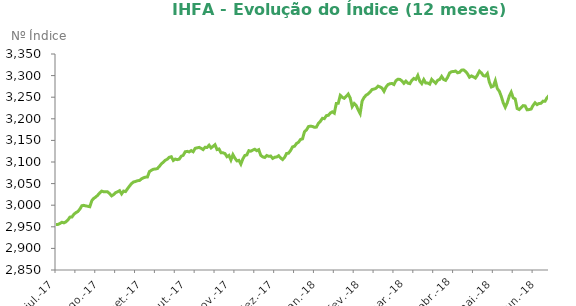
| Category | Series 0 |
|---|---|
| 2017-07-03 | 2955.6 |
| 2017-07-04 | 2955.56 |
| 2017-07-05 | 2957.73 |
| 2017-07-06 | 2960.53 |
| 2017-07-07 | 2959.17 |
| 2017-07-10 | 2961.57 |
| 2017-07-11 | 2965.8 |
| 2017-07-12 | 2972.4 |
| 2017-07-13 | 2972.53 |
| 2017-07-14 | 2979.01 |
| 2017-07-17 | 2982.73 |
| 2017-07-18 | 2985.4 |
| 2017-07-19 | 2990.95 |
| 2017-07-20 | 2998.74 |
| 2017-07-21 | 2999.62 |
| 2017-07-24 | 2998.28 |
| 2017-07-25 | 2997.56 |
| 2017-07-26 | 2996.42 |
| 2017-07-27 | 3010.5 |
| 2017-07-28 | 3015.89 |
| 2017-07-31 | 3018.91 |
| 2017-08-01 | 3023.15 |
| 2017-08-02 | 3028.5 |
| 2017-08-03 | 3032.62 |
| 2017-08-04 | 3031.1 |
| 2017-08-07 | 3030.9 |
| 2017-08-08 | 3030.85 |
| 2017-08-09 | 3026.58 |
| 2017-08-10 | 3021.59 |
| 2017-08-11 | 3024.69 |
| 2017-08-14 | 3029.04 |
| 2017-08-15 | 3031.14 |
| 2017-08-16 | 3033.62 |
| 2017-08-17 | 3026.19 |
| 2017-08-18 | 3032.71 |
| 2017-08-21 | 3031.49 |
| 2017-08-22 | 3038.28 |
| 2017-08-23 | 3044.37 |
| 2017-08-24 | 3050.08 |
| 2017-08-25 | 3053.71 |
| 2017-08-28 | 3054.88 |
| 2017-08-29 | 3056.68 |
| 2017-08-30 | 3057.22 |
| 2017-08-31 | 3060.96 |
| 2017-09-01 | 3063.36 |
| 2017-09-04 | 3064.89 |
| 2017-09-05 | 3065.3 |
| 2017-09-06 | 3077.87 |
| 2017-09-08 | 3080.91 |
| 2017-09-11 | 3083.37 |
| 2017-09-12 | 3083.7 |
| 2017-09-13 | 3084.82 |
| 2017-09-14 | 3089.87 |
| 2017-09-15 | 3095.68 |
| 2017-09-18 | 3099.68 |
| 2017-09-19 | 3104.11 |
| 2017-09-20 | 3106.43 |
| 2017-09-21 | 3110.87 |
| 2017-09-22 | 3112.23 |
| 2017-09-25 | 3103.56 |
| 2017-09-26 | 3106.82 |
| 2017-09-27 | 3105.4 |
| 2017-09-28 | 3106.68 |
| 2017-09-29 | 3113.35 |
| 2017-10-02 | 3115.51 |
| 2017-10-03 | 3123.73 |
| 2017-10-04 | 3124.65 |
| 2017-10-05 | 3123.31 |
| 2017-10-06 | 3126.44 |
| 2017-10-09 | 3123.64 |
| 2017-10-10 | 3131.59 |
| 2017-10-11 | 3132.76 |
| 2017-10-13 | 3133.85 |
| 2017-10-16 | 3131.7 |
| 2017-10-17 | 3128.73 |
| 2017-10-18 | 3134.21 |
| 2017-10-19 | 3133.57 |
| 2017-10-20 | 3138.87 |
| 2017-10-23 | 3132.56 |
| 2017-10-24 | 3136.24 |
| 2017-10-25 | 3140.07 |
| 2017-10-26 | 3128.75 |
| 2017-10-27 | 3130.14 |
| 2017-10-30 | 3121.42 |
| 2017-10-31 | 3121.27 |
| 2017-11-01 | 3119.52 |
| 2017-11-03 | 3112.33 |
| 2017-11-06 | 3115.26 |
| 2017-11-07 | 3104.62 |
| 2017-11-08 | 3116.99 |
| 2017-11-09 | 3108.9 |
| 2017-11-10 | 3102.58 |
| 2017-11-13 | 3103.84 |
| 2017-11-14 | 3095.13 |
| 2017-11-16 | 3107.22 |
| 2017-11-17 | 3115.17 |
| 2017-11-20 | 3116.49 |
| 2017-11-21 | 3126.26 |
| 2017-11-22 | 3124.96 |
| 2017-11-23 | 3127.6 |
| 2017-11-24 | 3129.52 |
| 2017-11-27 | 3126.12 |
| 2017-11-28 | 3128.45 |
| 2017-11-29 | 3115.32 |
| 2017-11-30 | 3111.86 |
| 2017-12-01 | 3110.48 |
| 2017-12-04 | 3115.05 |
| 2017-12-05 | 3113.11 |
| 2017-12-06 | 3113.79 |
| 2017-12-07 | 3108.29 |
| 2017-12-08 | 3110.94 |
| 2017-12-11 | 3111.59 |
| 2017-12-12 | 3114.54 |
| 2017-12-13 | 3109.29 |
| 2017-12-14 | 3105.72 |
| 2017-12-15 | 3110.9 |
| 2017-12-18 | 3119.71 |
| 2017-12-19 | 3120.39 |
| 2017-12-20 | 3126.67 |
| 2017-12-21 | 3135.04 |
| 2017-12-22 | 3136.49 |
| 2017-12-26 | 3142.86 |
| 2017-12-27 | 3145.84 |
| 2017-12-28 | 3152.16 |
| 2017-12-29 | 3153.5 |
| 2018-01-02 | 3170.15 |
| 2018-01-03 | 3174.19 |
| 2018-01-04 | 3182.03 |
| 2018-01-05 | 3183.06 |
| 2018-01-08 | 3182.29 |
| 2018-01-09 | 3180.25 |
| 2018-01-10 | 3180.83 |
| 2018-01-11 | 3189.52 |
| 2018-01-12 | 3194.23 |
| 2018-01-15 | 3201.07 |
| 2018-01-16 | 3200.35 |
| 2018-01-17 | 3207.32 |
| 2018-01-18 | 3208.02 |
| 2018-01-19 | 3213.38 |
| 2018-01-22 | 3216.1 |
| 2018-01-23 | 3213.02 |
| 2018-01-24 | 3235.46 |
| 2018-01-25 | 3235.9 |
| 2018-01-26 | 3254.25 |
| 2018-01-29 | 3249.85 |
| 2018-01-30 | 3247.44 |
| 2018-01-31 | 3251.9 |
| 2018-02-01 | 3257.2 |
| 2018-02-02 | 3247.85 |
| 2018-02-05 | 3228.32 |
| 2018-02-06 | 3235.4 |
| 2018-02-07 | 3231.06 |
| 2018-02-08 | 3221.02 |
| 2018-02-09 | 3212.06 |
| 2018-02-14 | 3241.17 |
| 2018-02-15 | 3249.43 |
| 2018-02-16 | 3254.74 |
| 2018-02-19 | 3257.39 |
| 2018-02-20 | 3262.06 |
| 2018-02-21 | 3267.78 |
| 2018-02-22 | 3268.88 |
| 2018-02-23 | 3270.63 |
| 2018-02-26 | 3275.64 |
| 2018-02-27 | 3273.84 |
| 2018-02-28 | 3271.09 |
| 2018-03-01 | 3263.6 |
| 2018-03-02 | 3273.55 |
| 2018-03-05 | 3279.17 |
| 2018-03-06 | 3281.16 |
| 2018-03-07 | 3281.81 |
| 2018-03-08 | 3279.36 |
| 2018-03-09 | 3288.21 |
| 2018-03-12 | 3291.69 |
| 2018-03-13 | 3291.07 |
| 2018-03-14 | 3287.69 |
| 2018-03-15 | 3282.12 |
| 2018-03-16 | 3287.18 |
| 2018-03-19 | 3282.48 |
| 2018-03-20 | 3281.26 |
| 2018-03-21 | 3289.12 |
| 2018-03-22 | 3293.36 |
| 2018-03-23 | 3291.23 |
| 2018-03-26 | 3300.31 |
| 2018-03-27 | 3286.92 |
| 2018-03-28 | 3281.5 |
| 2018-03-29 | 3290.85 |
| 2018-04-02 | 3282.85 |
| 2018-04-03 | 3282.86 |
| 2018-04-04 | 3280.33 |
| 2018-04-05 | 3291.32 |
| 2018-04-06 | 3286.65 |
| 2018-04-09 | 3282.37 |
| 2018-04-10 | 3289.1 |
| 2018-04-11 | 3291.08 |
| 2018-04-12 | 3298.09 |
| 2018-04-13 | 3291.02 |
| 2018-04-16 | 3288.97 |
| 2018-04-17 | 3296.01 |
| 2018-04-18 | 3306.15 |
| 2018-04-19 | 3309.1 |
| 2018-04-20 | 3309.38 |
| 2018-04-23 | 3310.6 |
| 2018-04-24 | 3306.55 |
| 2018-04-25 | 3307.53 |
| 2018-04-26 | 3312.68 |
| 2018-04-27 | 3313.15 |
| 2018-04-30 | 3309.82 |
| 2018-05-02 | 3304.29 |
| 2018-05-03 | 3296.23 |
| 2018-05-04 | 3299.24 |
| 2018-05-07 | 3297.06 |
| 2018-05-08 | 3294.35 |
| 2018-05-09 | 3301.14 |
| 2018-05-10 | 3310.32 |
| 2018-05-11 | 3306.02 |
| 2018-05-14 | 3299.78 |
| 2018-05-15 | 3299.01 |
| 2018-05-16 | 3304.81 |
| 2018-05-17 | 3284.84 |
| 2018-05-18 | 3273.56 |
| 2018-05-21 | 3275.4 |
| 2018-05-22 | 3288.28 |
| 2018-05-23 | 3269.97 |
| 2018-05-24 | 3263.91 |
| 2018-05-25 | 3251.85 |
| 2018-05-28 | 3236.72 |
| 2018-05-29 | 3226.77 |
| 2018-05-30 | 3237.03 |
| 2018-06-01 | 3252.23 |
| 2018-06-04 | 3261.53 |
| 2018-06-05 | 3248.4 |
| 2018-06-06 | 3245.93 |
| 2018-06-07 | 3223.62 |
| 2018-06-08 | 3221.39 |
| 2018-06-11 | 3225.92 |
| 2018-06-12 | 3230.51 |
| 2018-06-13 | 3229.9 |
| 2018-06-14 | 3220.83 |
| 2018-06-15 | 3221.4 |
| 2018-06-18 | 3222.49 |
| 2018-06-19 | 3231.17 |
| 2018-06-20 | 3237.12 |
| 2018-06-21 | 3232.83 |
| 2018-06-22 | 3235.35 |
| 2018-06-25 | 3235.9 |
| 2018-06-26 | 3240.87 |
| 2018-06-27 | 3240.52 |
| 2018-06-28 | 3248.89 |
| 2018-06-29 | 3253.77 |